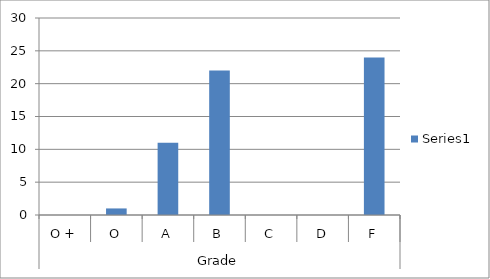
| Category | Series 0 |
|---|---|
| 0 | 0 |
| 1 | 1 |
| 2 | 11 |
| 3 | 22 |
| 4 | 0 |
| 5 | 0 |
| 6 | 24 |